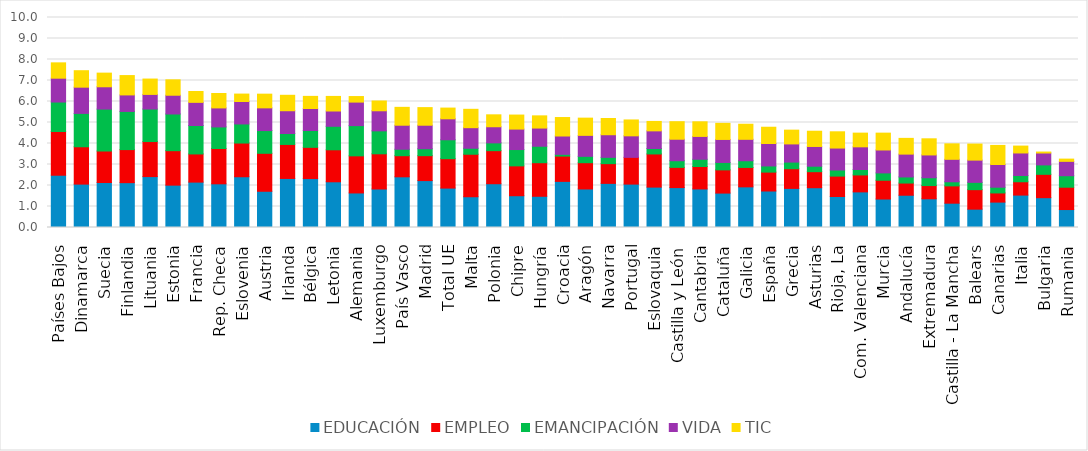
| Category | EDUCACIÓN | EMPLEO | EMANCIPACIÓN | VIDA | TIC |
|---|---|---|---|---|---|
| Países Bajos | 2.489 | 2.083 | 1.403 | 1.135 | 0.73 |
| Dinamarca | 2.066 | 1.779 | 1.588 | 1.249 | 0.784 |
| Suecia | 2.142 | 1.501 | 1.996 | 1.062 | 0.65 |
| Finlandia | 2.136 | 1.574 | 1.817 | 0.786 | 0.921 |
| Lituania | 2.425 | 1.668 | 1.549 | 0.696 | 0.731 |
| Estonia | 2.017 | 1.641 | 1.748 | 0.893 | 0.734 |
| Francia | 2.162 | 1.341 | 1.354 | 1.103 | 0.516 |
| Rep. Checa | 2.08 | 1.68 | 1.029 | 0.904 | 0.687 |
| Eslovenia | 2.417 | 1.605 | 0.909 | 1.068 | 0.354 |
| Austria | 1.726 | 1.808 | 1.083 | 1.081 | 0.653 |
| Irlanda | 2.336 | 1.62 | 0.521 | 1.084 | 0.735 |
| Bélgica | 2.331 | 1.487 | 0.803 | 1.046 | 0.578 |
| Letonia | 2.177 | 1.524 | 1.119 | 0.728 | 0.694 |
| Alemania | 1.645 | 1.767 | 1.439 | 1.12 | 0.264 |
| Luxemburgo | 1.834 | 1.676 | 1.093 | 0.955 | 0.466 |
| País Vasco | 2.414 | 1.006 | 0.308 | 1.144 | 0.851 |
| Madrid | 2.234 | 1.187 | 0.33 | 1.12 | 0.838 |
| Total UE | 1.877 | 1.4 | 0.901 | 0.998 | 0.511 |
| Malta | 1.465 | 2.023 | 0.286 | 0.979 | 0.875 |
| Polonia | 2.085 | 1.574 | 0.372 | 0.768 | 0.568 |
| Chipre | 1.513 | 1.422 | 0.777 | 0.974 | 0.668 |
| Hungría | 1.486 | 1.599 | 0.784 | 0.866 | 0.581 |
| Croacia | 2.196 | 1.205 | 0.083 | 0.873 | 0.88 |
| Aragón | 1.835 | 1.251 | 0.303 | 0.998 | 0.82 |
| Navarra | 2.101 | 0.94 | 0.3 | 1.076 | 0.773 |
| Portugal | 2.067 | 1.273 | 0 | 1.025 | 0.756 |
| Eslovaquia | 1.924 | 1.578 | 0.259 | 0.84 | 0.449 |
| Castilla y León | 1.9 | 0.964 | 0.316 | 1.023 | 0.836 |
| Cantabria | 1.837 | 1.067 | 0.347 | 1.087 | 0.696 |
| Cataluña | 1.639 | 1.105 | 0.354 | 1.095 | 0.768 |
| Galicia | 1.935 | 0.925 | 0.318 | 1.02 | 0.719 |
| España | 1.738 | 0.9 | 0.293 | 1.07 | 0.774 |
| Grecia | 1.862 | 0.937 | 0.316 | 0.865 | 0.656 |
| Asturias | 1.894 | 0.764 | 0.261 | 0.939 | 0.726 |
| Rioja, La | 1.475 | 0.973 | 0.29 | 1.046 | 0.774 |
| Com. Valenciana | 1.696 | 0.808 | 0.258 | 1.079 | 0.653 |
| Murcia | 1.356 | 0.894 | 0.35 | 1.091 | 0.802 |
| Andalucía | 1.537 | 0.58 | 0.291 | 1.087 | 0.75 |
| Extremadura | 1.367 | 0.63 | 0.372 | 1.086 | 0.768 |
| Castilla - La Mancha | 1.157 | 0.825 | 0.194 | 1.07 | 0.737 |
| Balears | 0.873 | 0.929 | 0.348 | 1.059 | 0.764 |
| Canarias | 1.21 | 0.436 | 0.273 | 1.081 | 0.908 |
| Italia | 1.543 | 0.635 | 0.3 | 1.071 | 0.328 |
| Bulgaria | 1.42 | 1.112 | 0.449 | 0.566 | 0.046 |
| Rumania | 0.855 | 1.064 | 0.547 | 0.685 | 0.107 |